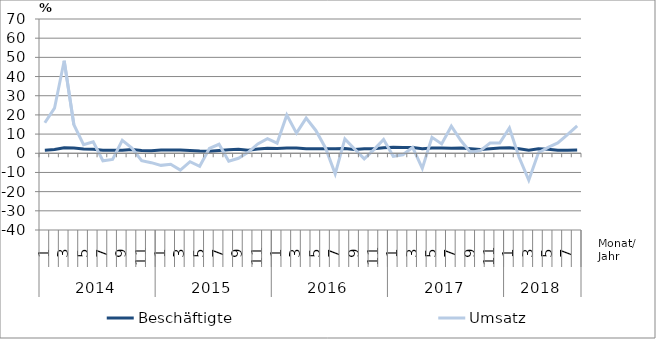
| Category | Beschäftigte | Umsatz |
|---|---|---|
| 0 | 1.6 | 15.9 |
| 1 | 2 | 23.5 |
| 2 | 2.9 | 48.2 |
| 3 | 2.8 | 14.9 |
| 4 | 2.2 | 4.5 |
| 5 | 2.1 | 6 |
| 6 | 1.6 | -3.9 |
| 7 | 1.6 | -3.2 |
| 8 | 1.6 | 6.8 |
| 9 | 2 | 2.7 |
| 10 | 1.4 | -3.9 |
| 11 | 1.3 | -4.9 |
| 12 | 1.7 | -6.3 |
| 13 | 1.7 | -5.7 |
| 14 | 1.7 | -8.8 |
| 15 | 1.5 | -4.4 |
| 16 | 1.2 | -6.8 |
| 17 | 1.1 | 2.5 |
| 18 | 1.5 | 4.7 |
| 19 | 1.8 | -4.1 |
| 20 | 2.1 | -2.6 |
| 21 | 1.6 | 0.5 |
| 22 | 2.2 | 4.9 |
| 23 | 2.6 | 7.6 |
| 24 | 2.5 | 5.3 |
| 25 | 2.7 | 19.9 |
| 26 | 2.8 | 10.5 |
| 27 | 2.4 | 18.3 |
| 28 | 2.4 | 11.9 |
| 29 | 2.4 | 2.8 |
| 30 | 2.3 | -10.7 |
| 31 | 2.5 | 7.5 |
| 32 | 2 | 2.2 |
| 33 | 2.4 | -2.9 |
| 34 | 2.3 | 1.9 |
| 35 | 2.9 | 7.2 |
| 36 | 3.1 | -1.6 |
| 37 | 3 | -0.8 |
| 38 | 3 | 3.1 |
| 39 | 2.4 | -7.9 |
| 40 | 2.8 | 8.3 |
| 41 | 2.7 | 4.9 |
| 42 | 2.6 | 14.1 |
| 43 | 2.7 | 6.5 |
| 44 | 2.3 | 0.4 |
| 45 | 2 | 1.4 |
| 46 | 2.4 | 5.3 |
| 47 | 2.8 | 5.3 |
| 48 | 2.9 | 13.2 |
| 49 | 2.3 | -2.1 |
| 50 | 1.6 | -14 |
| 51 | 2.3 | 0.3 |
| 52 | 2.1 | 3.1 |
| 53 | 1.6 | 5.4 |
| 54 | 1.6 | 9.7 |
| 55 | 1.7 | 14.3 |